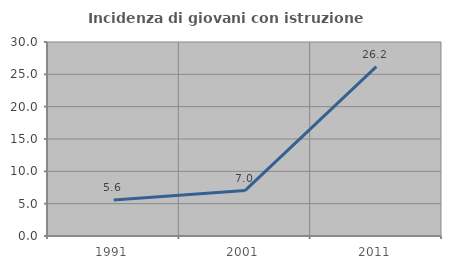
| Category | Incidenza di giovani con istruzione universitaria |
|---|---|
| 1991.0 | 5.556 |
| 2001.0 | 7.018 |
| 2011.0 | 26.19 |